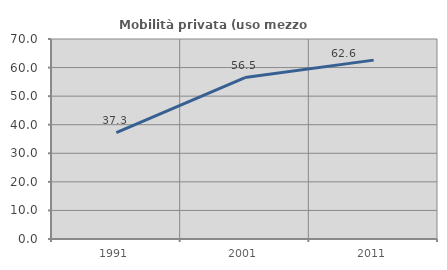
| Category | Mobilità privata (uso mezzo privato) |
|---|---|
| 1991.0 | 37.27 |
| 2001.0 | 56.519 |
| 2011.0 | 62.604 |